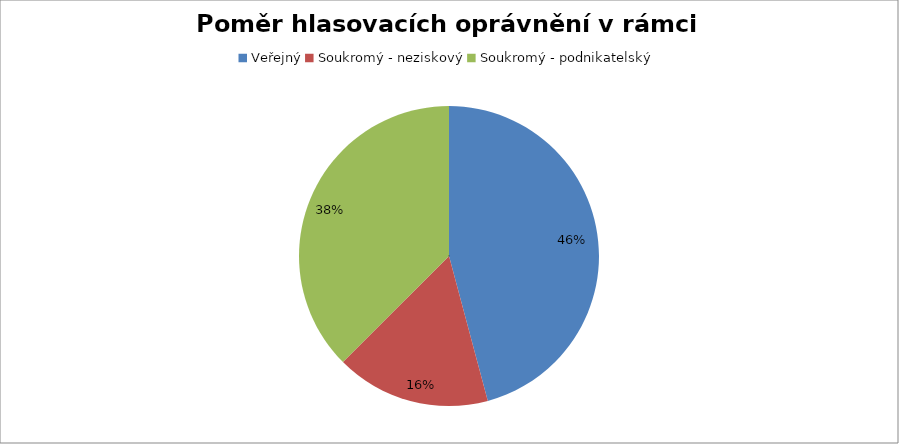
| Category | Series 0 |
|---|---|
| Veřejný | 0.458 |
| Soukromý - neziskový | 0.167 |
| Soukromý - podnikatelský | 0.375 |